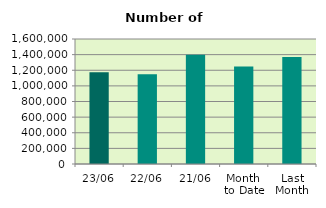
| Category | Series 0 |
|---|---|
| 23/06 | 1173914 |
| 22/06 | 1150102 |
| 21/06 | 1398698 |
| Month 
to Date | 1246827.059 |
| Last
Month | 1368600.286 |